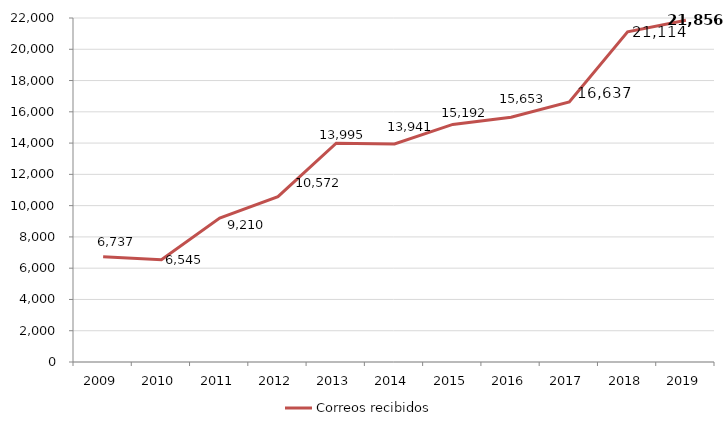
| Category | Correos recibidos |
|---|---|
| 2009.0 | 6737 |
| 2010.0 | 6545 |
| 2011.0 | 9210 |
| 2012.0 | 10572 |
| 2013.0 | 13995 |
| 2014.0 | 13941 |
| 2015.0 | 15192 |
| 2016.0 | 15653 |
| 2017.0 | 16637 |
| 2018.0 | 21114 |
| 2019.0 | 21856 |